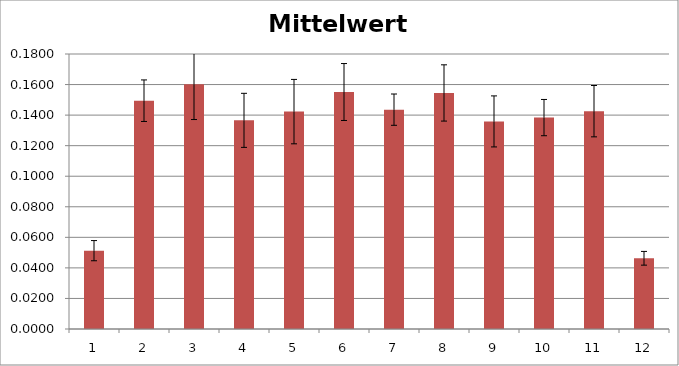
| Category | Mittelwert korriigert |
|---|---|
| 0 | 0.051 |
| 1 | 0.149 |
| 2 | 0.16 |
| 3 | 0.137 |
| 4 | 0.142 |
| 5 | 0.155 |
| 6 | 0.144 |
| 7 | 0.155 |
| 8 | 0.136 |
| 9 | 0.138 |
| 10 | 0.143 |
| 11 | 0.046 |